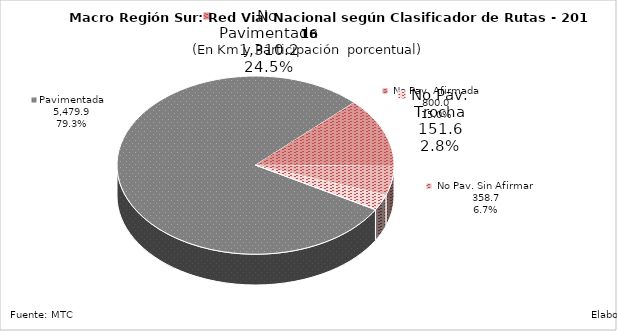
| Category | Series 0 |
|---|---|
| Pavimentada | 5479.882 |
| No Pavimentada                   Afirmada | 872.471 |
| No Pavimentada                   Sin Afirmar | 363.716 |
| No Pavimentada                            Trocha | 197.432 |